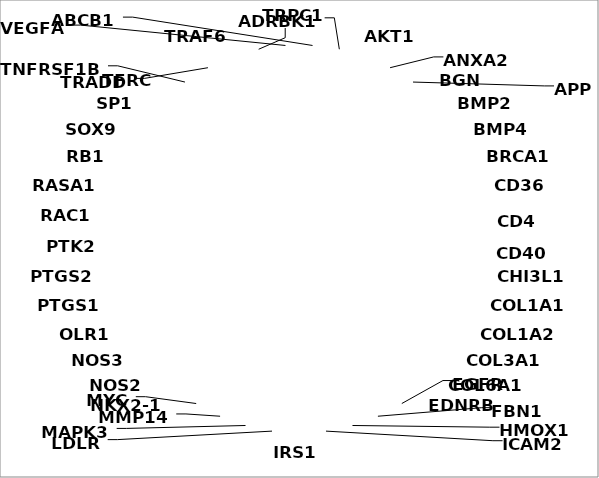
| Category | Series 0 |
|---|---|
| ABCB1 | 1 |
| ADRBK1 | 1 |
| AKT1 | 1 |
| ANXA2 | 1 |
| APP | 1 |
| BGN | 1 |
| BMP2 | 1 |
| BMP4 | 1 |
| BRCA1 | 1 |
| CD36 | 1 |
| CD4 | 1 |
| CD40 | 1 |
| CHI3L1 | 1 |
| COL1A1 | 1 |
| COL1A2 | 1 |
| COL3A1 | 1 |
| COL6A1 | 1 |
| EDNRB | 1 |
| EGFR | 1 |
| FBN1 | 1 |
| HMOX1 | 1 |
| ICAM2 | 1 |
| IRS1 | 1 |
| LDLR | 1 |
| MAPK3 | 1 |
| MMP14 | 1 |
| MYC | 1 |
| NKX2-1 | 1 |
| NOS2 | 1 |
| NOS3 | 1 |
| OLR1 | 1 |
| PTGS1 | 1 |
| PTGS2 | 1 |
| PTK2 | 1 |
| RAC1 | 1 |
| RASA1 | 1 |
| RB1 | 1 |
| SOX9 | 1 |
| SP1 | 1 |
| TFRC | 1 |
| TNFRSF1B | 1 |
| TRADD | 1 |
| TRAF6 | 1 |
| TRPC1 | 1 |
| VEGFA | 1 |